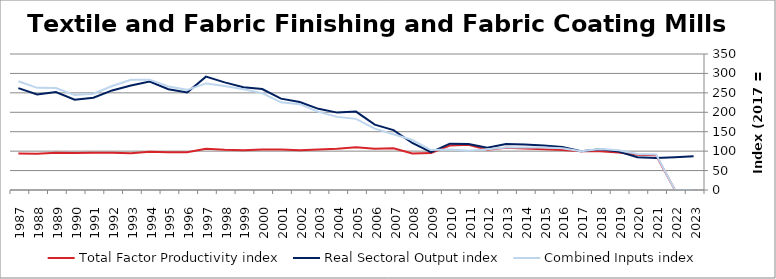
| Category | Total Factor Productivity index | Real Sectoral Output index | Combined Inputs index |
|---|---|---|---|
| 2023.0 | 0 | 86.736 | 0 |
| 2022.0 | 0 | 84.255 | 0 |
| 2021.0 | 89.662 | 82.113 | 91.58 |
| 2020.0 | 90.712 | 84.189 | 92.81 |
| 2019.0 | 96.784 | 99.186 | 102.482 |
| 2018.0 | 99.64 | 105.023 | 105.402 |
| 2017.0 | 100 | 100 | 100 |
| 2016.0 | 102.903 | 110.838 | 107.712 |
| 2015.0 | 104.675 | 114.519 | 109.404 |
| 2014.0 | 106.988 | 116.964 | 109.324 |
| 2013.0 | 108.561 | 118.621 | 109.267 |
| 2012.0 | 103.619 | 108.706 | 104.909 |
| 2011.0 | 116.678 | 118.091 | 101.211 |
| 2010.0 | 114.306 | 119.2 | 104.282 |
| 2009.0 | 94.908 | 97.501 | 102.731 |
| 2008.0 | 94.044 | 121.002 | 128.666 |
| 2007.0 | 107.418 | 154.175 | 143.528 |
| 2006.0 | 106.429 | 168.202 | 158.04 |
| 2005.0 | 110.195 | 201.718 | 183.055 |
| 2004.0 | 105.853 | 199.171 | 188.158 |
| 2003.0 | 103.917 | 208.862 | 200.99 |
| 2002.0 | 102.472 | 226.376 | 220.915 |
| 2001.0 | 104.189 | 235.058 | 225.608 |
| 2000.0 | 104.164 | 259.679 | 249.298 |
| 1999.0 | 102.02 | 264.534 | 259.296 |
| 1998.0 | 103.512 | 276.996 | 267.599 |
| 1997.0 | 106.321 | 291.664 | 274.325 |
| 1996.0 | 97.454 | 251.161 | 257.722 |
| 1995.0 | 97.462 | 259.448 | 266.203 |
| 1994.0 | 98.348 | 279.329 | 284.022 |
| 1993.0 | 94.781 | 269.091 | 283.907 |
| 1992.0 | 95.817 | 256.3 | 267.49 |
| 1991.0 | 95.869 | 237.386 | 247.616 |
| 1990.0 | 95.194 | 232.562 | 244.304 |
| 1989.0 | 96.112 | 252.126 | 262.326 |
| 1988.0 | 93.5 | 245.876 | 262.967 |
| 1987.0 | 93.66 | 262.192 | 279.939 |